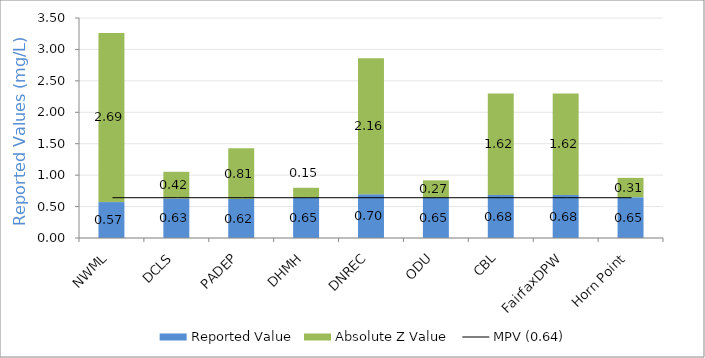
| Category | Reported Value | Absolute Z Value  |
|---|---|---|
| NWML | 0.571 | 2.692 |
| DCLS | 0.63 | 0.423 |
| PADEP | 0.62 | 0.808 |
| DHMH | 0.645 | 0.154 |
| DNREC | 0.697 | 2.162 |
| ODU | 0.648 | 0.269 |
| CBL | 0.683 | 1.615 |
| FairfaxDPW | 0.683 | 1.615 |
| Horn Point | 0.649 | 0.308 |